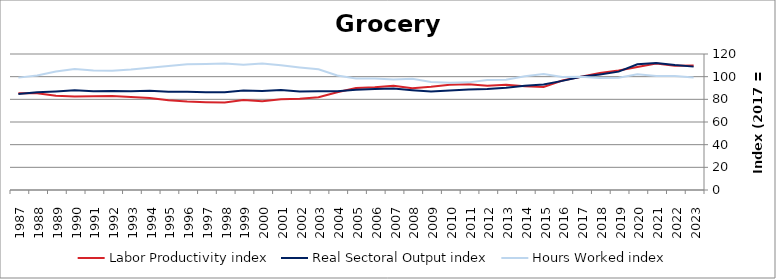
| Category | Labor Productivity index | Real Sectoral Output index | Hours Worked index |
|---|---|---|---|
| 2023.0 | 109.743 | 108.862 | 99.197 |
| 2022.0 | 109.543 | 110.248 | 100.644 |
| 2021.0 | 111.527 | 112.1 | 100.514 |
| 2020.0 | 108.579 | 110.983 | 102.214 |
| 2019.0 | 105.419 | 104.44 | 99.071 |
| 2018.0 | 103.143 | 101.949 | 98.843 |
| 2017.0 | 100 | 100 | 100 |
| 2016.0 | 96.671 | 96.301 | 99.617 |
| 2015.0 | 90.937 | 93.1 | 102.378 |
| 2014.0 | 91.624 | 92.041 | 100.455 |
| 2013.0 | 92.765 | 90.3 | 97.343 |
| 2012.0 | 91.912 | 89.126 | 96.97 |
| 2011.0 | 93.273 | 88.576 | 94.965 |
| 2010.0 | 92.817 | 87.843 | 94.641 |
| 2009.0 | 91.07 | 86.806 | 95.318 |
| 2008.0 | 89.768 | 88.048 | 98.084 |
| 2007.0 | 91.91 | 89.516 | 97.395 |
| 2006.0 | 90.721 | 89.223 | 98.349 |
| 2005.0 | 89.926 | 88.409 | 98.312 |
| 2004.0 | 86.282 | 87.122 | 100.974 |
| 2003.0 | 81.843 | 87.136 | 106.466 |
| 2002.0 | 80.492 | 86.994 | 108.078 |
| 2001.0 | 80.118 | 88.165 | 110.044 |
| 2000.0 | 78.414 | 87.445 | 111.518 |
| 1999.0 | 79.434 | 87.747 | 110.465 |
| 1998.0 | 77.178 | 86.201 | 111.691 |
| 1997.0 | 77.519 | 86.253 | 111.266 |
| 1996.0 | 78.096 | 86.587 | 110.871 |
| 1995.0 | 79.21 | 86.596 | 109.325 |
| 1994.0 | 81.148 | 87.471 | 107.792 |
| 1993.0 | 81.958 | 87.115 | 106.292 |
| 1992.0 | 82.992 | 87.316 | 105.211 |
| 1991.0 | 82.647 | 87.071 | 105.353 |
| 1990.0 | 82.536 | 88.045 | 106.676 |
| 1989.0 | 83.17 | 86.966 | 104.565 |
| 1988.0 | 85.362 | 86.244 | 101.034 |
| 1987.0 | 85.356 | 84.63 | 99.149 |